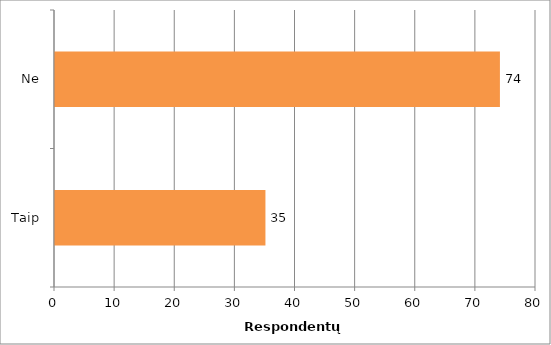
| Category | Series 0 |
|---|---|
| Taip | 35 |
| Ne | 74 |